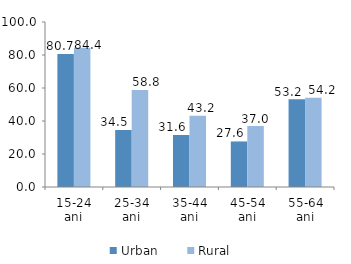
| Category | Urban | Rural |
|---|---|---|
| 15-24 ani | 80.653 | 84.398 |
| 25-34 ani | 34.535 | 58.818 |
| 35-44 ani | 31.571 | 43.201 |
| 45-54 ani | 27.602 | 37.045 |
| 55-64 ani | 53.212 | 54.158 |